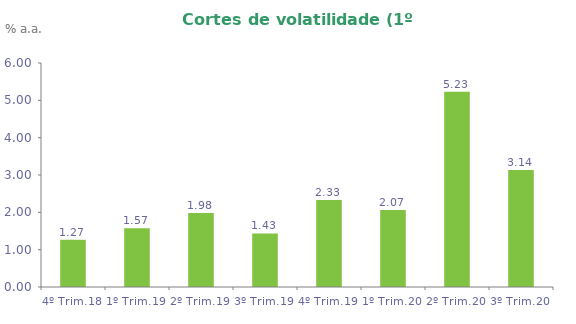
| Category | Series 0 |
|---|---|
| 4º Trim.18 | 1.268 |
| 1º Trim.19 | 1.573 |
| 2º Trim.19 | 1.98 |
| 3º Trim.19 | 1.435 |
| 4º Trim.19 | 2.33 |
| 1º Trim.20 | 2.065 |
| 2º Trim.20 | 5.231 |
| 3º Trim.20 | 3.137 |